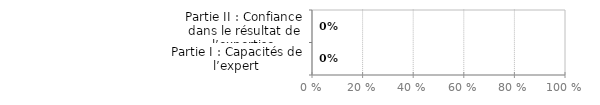
| Category | Parties |
|---|---|
| Partie I : Capacités de l’expert | 0 |
| Partie II : Confiance dans le résultat de l’expertise | 0 |